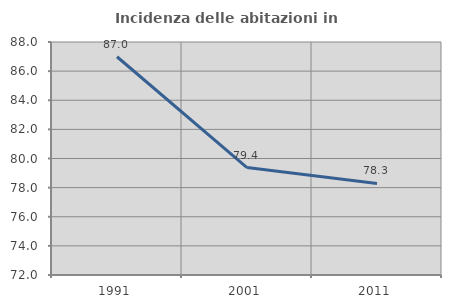
| Category | Incidenza delle abitazioni in proprietà  |
|---|---|
| 1991.0 | 86.986 |
| 2001.0 | 79.375 |
| 2011.0 | 78.286 |